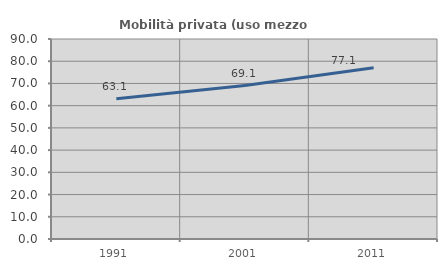
| Category | Mobilità privata (uso mezzo privato) |
|---|---|
| 1991.0 | 63.103 |
| 2001.0 | 69.061 |
| 2011.0 | 77.064 |